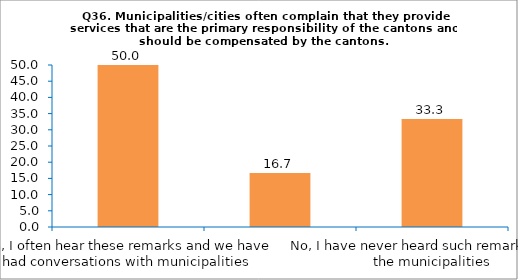
| Category | Series 0 |
|---|---|
| Yes, I often hear these remarks and we have had conversations with municipalities | 50 |
| Yes, I hear these remarks, but we have not had conversations with municipalities  | 16.667 |
| No, I have never heard such remarks from the municipalities | 33.333 |